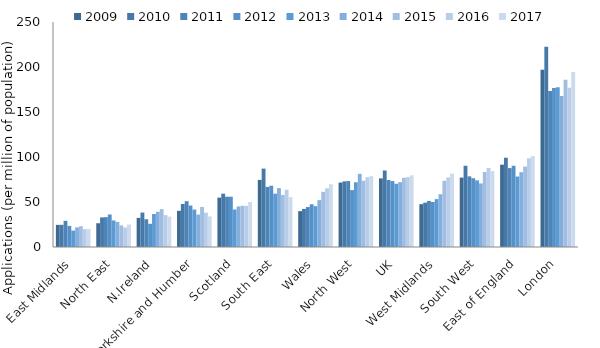
| Category | 2009 | 2010 | 2011 | 2012 | 2013 | 2014 | 2015 | 2016 | 2017 |
|---|---|---|---|---|---|---|---|---|---|
| East Midlands | 24.599 | 24.628 | 29.092 | 23.425 | 18.267 | 21.779 | 23.09 | 19.892 | 19.909 |
| North East | 26.404 | 32.858 | 33.123 | 36.121 | 29.495 | 27.876 | 24.004 | 21.619 | 24.956 |
| N.Ireland | 32.343 | 38.231 | 30.866 | 25.773 | 36.618 | 39.12 | 42.126 | 35.444 | 33.675 |
| Yorkshire and Humber | 40.204 | 47.766 | 50.868 | 46.079 | 41.589 | 36.007 | 44.525 | 38.154 | 33.944 |
| Scotland | 54.856 | 59.291 | 55.85 | 55.894 | 41.669 | 45.067 | 45.784 | 45.701 | 49.956 |
| South East | 74.55 | 87.085 | 66.799 | 68.081 | 59.25 | 65.472 | 57.881 | 63.564 | 55.392 |
| Wales | 39.817 | 42.295 | 44.389 | 47.494 | 45.419 | 52.07 | 61.308 | 65.206 | 69.756 |
| North West | 71.57 | 72.936 | 73.271 | 63.237 | 71.936 | 81.312 | 73.587 | 77.519 | 78.665 |
| UK | 76.196 | 85.007 | 74.409 | 73.291 | 70.243 | 72.032 | 76.839 | 77.626 | 79.618 |
| West Midlands | 47.576 | 49.228 | 51.171 | 49.975 | 53.216 | 58.634 | 73.501 | 77.27 | 81.56 |
| South West | 77.103 | 90.282 | 78.479 | 76.409 | 74.009 | 70.621 | 83.339 | 87.729 | 84.363 |
| East of England | 91.456 | 99.184 | 87.677 | 90.249 | 78.294 | 83.094 | 89.368 | 98.548 | 100.999 |
| London | 197.039 | 222.539 | 173.322 | 176.68 | 177.369 | 167.81 | 185.764 | 176.859 | 194.448 |